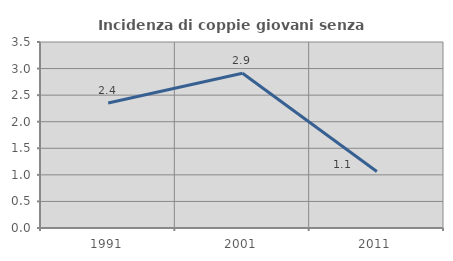
| Category | Incidenza di coppie giovani senza figli |
|---|---|
| 1991.0 | 2.353 |
| 2001.0 | 2.913 |
| 2011.0 | 1.064 |